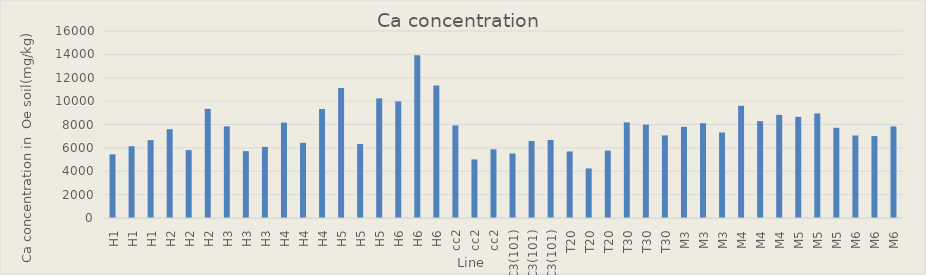
| Category | Series 0 |
|---|---|
| H1 | 5448.749 |
| H1 | 6139.336 |
| H1 | 6660.532 |
| H2 | 7597.954 |
| H2 | 5813.294 |
| H2 | 9339.409 |
| H3 | 7840.576 |
| H3 | 5721.992 |
| H3 | 6085.286 |
| H4 | 8162.414 |
| H4 | 6431.381 |
| H4 | 9322.968 |
| H5 | 11112.762 |
| H5 | 6332.329 |
| H5 | 10235.866 |
| H6 | 9974.825 |
| H6 | 13928.222 |
| H6 | 11330.975 |
| cc2 | 7919.287 |
| cc2 | 5014.355 |
| cc2 | 5878.935 |
| C3(101) | 5520.077 |
| C3(101) | 6585.57 |
| C3(101) | 6681.164 |
| T20 | 5693.339 |
| T20 | 4240.269 |
| T20 | 5764.483 |
| T30 | 8183.376 |
| T30 | 7986.272 |
| T30 | 7069.333 |
| M3 | 7803.452 |
| M3 | 8109.158 |
| M3 | 7321.174 |
| M4 | 9604.042 |
| M4 | 8288.37 |
| M4 | 8825.387 |
| M5 | 8652.568 |
| M5 | 8947.108 |
| M5 | 7715.807 |
| M6 | 7061.582 |
| M6 | 7009.498 |
| M6 | 7832.021 |